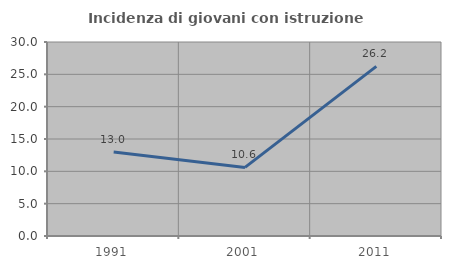
| Category | Incidenza di giovani con istruzione universitaria |
|---|---|
| 1991.0 | 12.987 |
| 2001.0 | 10.606 |
| 2011.0 | 26.23 |